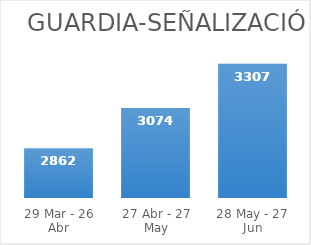
| Category | Series 0 |
|---|---|
| 29 Mar - 26 Abr | 2862 |
| 27 Abr - 27 May | 3074 |
| 28 May - 27 Jun | 3307 |